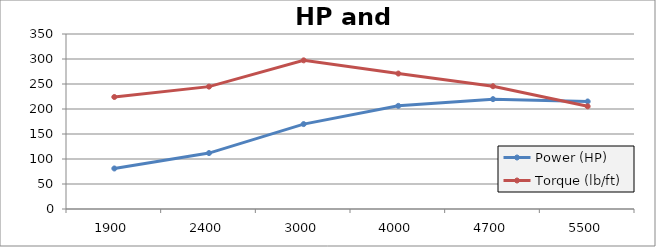
| Category | Power (HP) | Torque (lb/ft) |
|---|---|---|
| 1900.0 | 81.042 | 224.017 |
| 2400.0 | 111.844 | 244.752 |
| 3000.0 | 169.829 | 297.314 |
| 4000.0 | 206.311 | 270.886 |
| 4700.0 | 219.716 | 245.521 |
| 5500.0 | 215.041 | 205.345 |